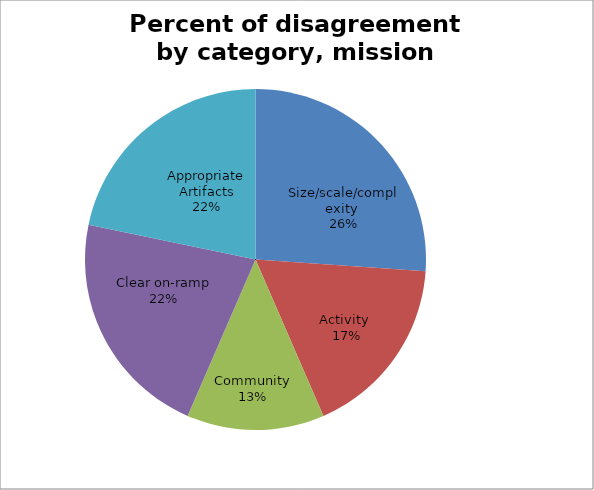
| Category | Percent of disagreement by category, mission critical |
|---|---|
| Size/scale/complexity  | 6 |
| Activity  | 4 |
| Community | 3 |
| Clear on-ramp | 5 |
| Appropriate Artifacts | 5 |